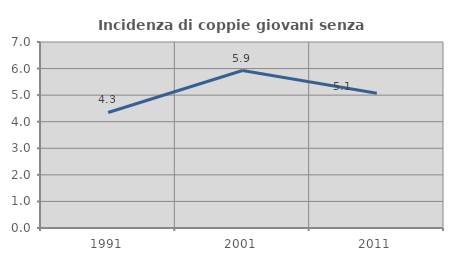
| Category | Incidenza di coppie giovani senza figli |
|---|---|
| 1991.0 | 4.348 |
| 2001.0 | 5.926 |
| 2011.0 | 5.072 |